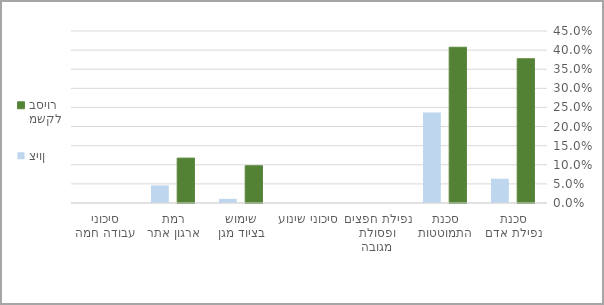
| Category | משקל בסיור | ציון |
|---|---|---|
| סכנת נפילת אדם | 0.378 | 0.063 |
| סכנת התמוטטות | 0.408 | 0.237 |
| נפילת חפצים ופסולת מגובה | 0 | 0 |
| סיכוני שינוע | 0 | 0 |
| שימוש בציוד מגן | 0.098 | 0.011 |
| רמת ארגון אתר | 0.118 | 0.046 |
| סיכוני עבודה חמה | 0 | 0 |